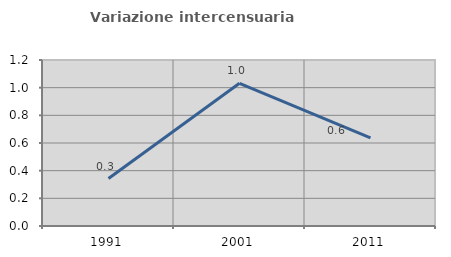
| Category | Variazione intercensuaria annua |
|---|---|
| 1991.0 | 0.343 |
| 2001.0 | 1.031 |
| 2011.0 | 0.638 |